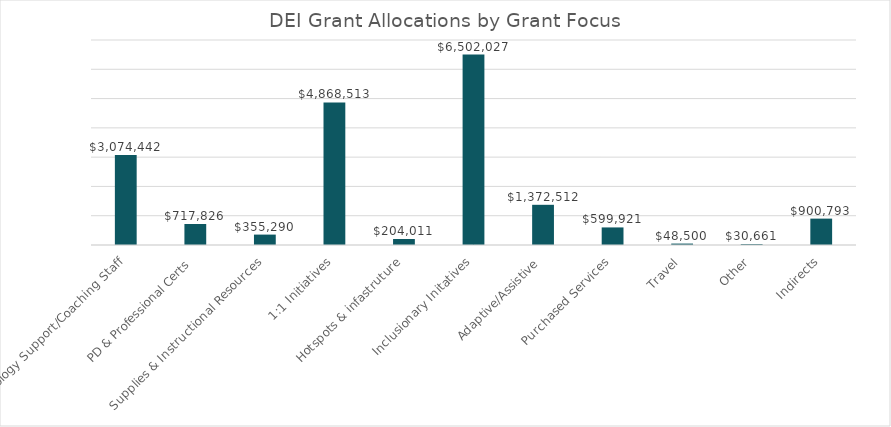
| Category | Series 0 |
|---|---|
| Technology Support/Coaching Staff | 3074442 |
| PD & Professional Certs | 717826 |
| Supplies & Instructional Resources | 355290 |
| 1:1 Initiatives | 4868513 |
| Hotspots & infastruture | 204011 |
| Inclusionary Initatives | 6502027 |
| Adaptive/Assistive | 1372512 |
| Purchased Services | 599921 |
| Travel | 48500 |
| Other | 30661 |
| Indirects | 900793 |